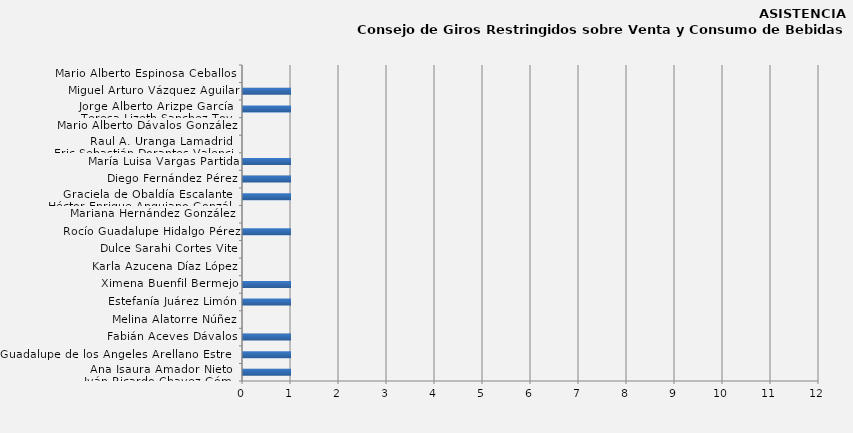
| Category | Ana Isaura Amador Nieto / 
Iván Ricardo Chavez Gómez |
|---|---|
| Ana Isaura Amador Nieto / 
Iván Ricardo Chavez Gómez | 1 |
| Guadalupe de los Ángeles Arellano Estrella | 1 |
| Fabián Aceves Dávalos | 1 |
| Melina Alatorre Núñez | 0 |
| Estefanía Juárez Limón | 1 |
| Ximena Buenfil Bermejo | 1 |
| Karla Azucena Díaz López | 0 |
| Dulce Sarahi Cortes Vite | 0 |
| Rocío Guadalupe Hidalgo Pérez | 1 |
| Mariana Hernández González  | 0 |
| Graciela de Obaldía Escalante / 
Héctor Enrique Anguiano González | 1 |
| Diego Fernández Pérez | 1 |
| María Luisa Vargas Partida | 1 |
| Raul A. Uranga Lamadrid / 
Eric Sebastián Dorantes Valencia  | 0 |
| Mario Alberto Dávalos González  | 0 |
| Jorge Alberto Arizpe García / 
Teresa Lizeth Sanchez Tovar | 1 |
| Miguel Arturo Vázquez Aguilar | 1 |
| Mario Alberto Espinosa Ceballos  | 0 |